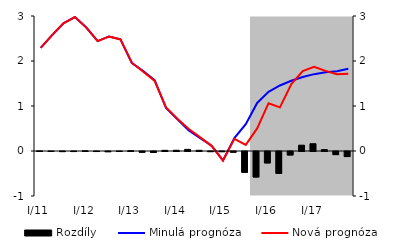
| Category | Rozdíly |
|---|---|
| 0 | 0.002 |
| 1 | 0 |
| 2 | -0.002 |
| 3 | -0.001 |
| 4 | 0.005 |
| 5 | -0.001 |
| 6 | -0.004 |
| 7 | -0.001 |
| 8 | 0.007 |
| 9 | -0.016 |
| 10 | -0.021 |
| 11 | 0.015 |
| 12 | 0.016 |
| 13 | 0.036 |
| 14 | 0.015 |
| 15 | -0.003 |
| 16 | -0.004 |
| 17 | -0.015 |
| 18 | -0.462 |
| 19 | -0.566 |
| 20 | -0.253 |
| 21 | -0.487 |
| 22 | -0.077 |
| 23 | 0.129 |
| 24 | 0.162 |
| 25 | 0.031 |
| 26 | -0.069 |
| 27 | -0.112 |